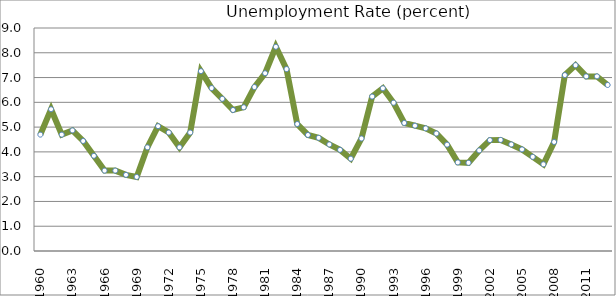
| Category | Series 0 |
|---|---|
| 1960.0 | 4.696 |
| 1961.0 | 5.721 |
| 1962.0 | 4.696 |
| 1963.0 | 4.867 |
| 1964.0 | 4.44 |
| 1965.0 | 3.843 |
| 1966.0 | 3.245 |
| 1967.0 | 3.245 |
| 1968.0 | 3.074 |
| 1969.0 | 2.989 |
| 1970.0 | 4.184 |
| 1971.0 | 5.038 |
| 1972.0 | 4.782 |
| 1973.0 | 4.184 |
| 1974.0 | 4.782 |
| 1975.0 | 7.258 |
| 1976.0 | 6.575 |
| 1977.0 | 6.142 |
| 1978.0 | 5.692 |
| 1979.0 | 5.8 |
| 1980.0 | 6.617 |
| 1981.0 | 7.175 |
| 1982.0 | 8.242 |
| 1983.0 | 7.342 |
| 1984.0 | 5.125 |
| 1985.0 | 4.683 |
| 1986.0 | 4.567 |
| 1987.0 | 4.3 |
| 1988.0 | 4.083 |
| 1989.0 | 3.725 |
| 1990.0 | 4.542 |
| 1991.0 | 6.233 |
| 1992.0 | 6.567 |
| 1993.0 | 5.983 |
| 1994.0 | 5.167 |
| 1995.0 | 5.058 |
| 1996.0 | 4.95 |
| 1997.0 | 4.742 |
| 1998.0 | 4.292 |
| 1999.0 | 3.575 |
| 2000.0 | 3.558 |
| 2001.0 | 4.058 |
| 2002.0 | 4.475 |
| 2003.0 | 4.483 |
| 2004.0 | 4.3 |
| 2005.0 | 4.1 |
| 2006.0 | 3.8 |
| 2007.0 | 3.5 |
| 2008.0 | 4.4 |
| 2009.0 | 7.1 |
| 2010.0 | 7.5 |
| 2011.0 | 7.047 |
| 2012.0 | 7.047 |
| 2013.0 | 6.7 |